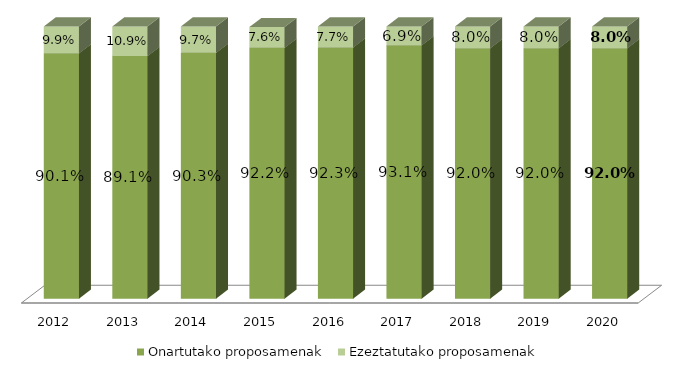
| Category | Onartutako proposamenak | Ezeztatutako proposamenak |
|---|---|---|
| 2012.0 | 0.901 | 0.099 |
| 2013.0 | 0.891 | 0.109 |
| 2014.0 | 0.903 | 0.097 |
| 2015.0 | 0.922 | 0.076 |
| 2016.0 | 0.923 | 0.077 |
| 2017.0 | 0.931 | 0.069 |
| 2018.0 | 0.92 | 0.08 |
| 2019.0 | 0.92 | 0.08 |
| 2020.0 | 0.92 | 0.08 |